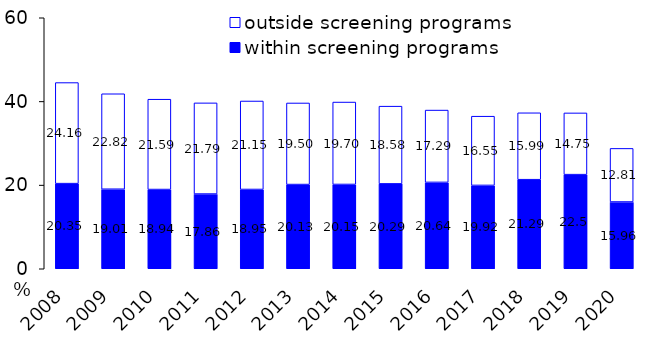
| Category | within screening programs | outside screening programs |
|---|---|---|
| 2008.0 | 20.35 | 24.16 |
| 2009.0 | 19.01 | 22.82 |
| 2010.0 | 18.94 | 21.59 |
| 2011.0 | 17.86 | 21.79 |
| 2012.0 | 18.95 | 21.15 |
| 2013.0 | 20.13 | 19.5 |
| 2014.0 | 20.15 | 19.7 |
| 2015.0 | 20.29 | 18.58 |
| 2016.0 | 20.64 | 17.29 |
| 2017.0 | 19.92 | 16.55 |
| 2018.0 | 21.29 | 15.99 |
| 2019.0 | 22.5 | 14.75 |
| 2020.0 | 15.96 | 12.81 |